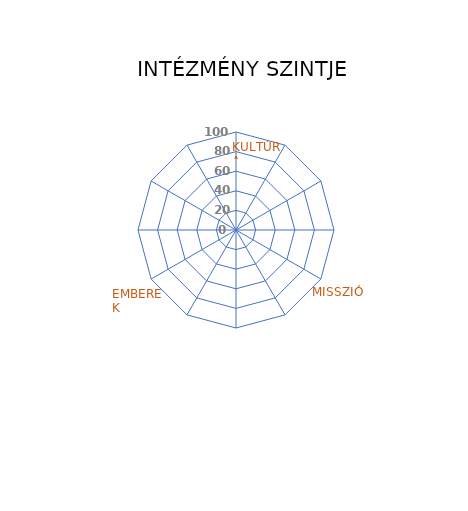
| Category | Series 0 |
|---|---|
| VEZETÉS | 0 |
| STRATÉGIA | 0 |
| INKLUZÍV KONTEXTUS | 0 |
| MÉRÉS | 0 |
| TANTERVEK | 0 |
| KUTATÁS | 0 |
| MEGSZÓLÍTÁSA | 0 |
| FINANSZÍROZÁS | 0 |
| AZONOSÍTÁS | 0 |
| KONZULTÁCIÓ | 0 |
| RÉSZVÉTEL | 0 |
| EGYÜTTMŰKÖDÉS | 0 |